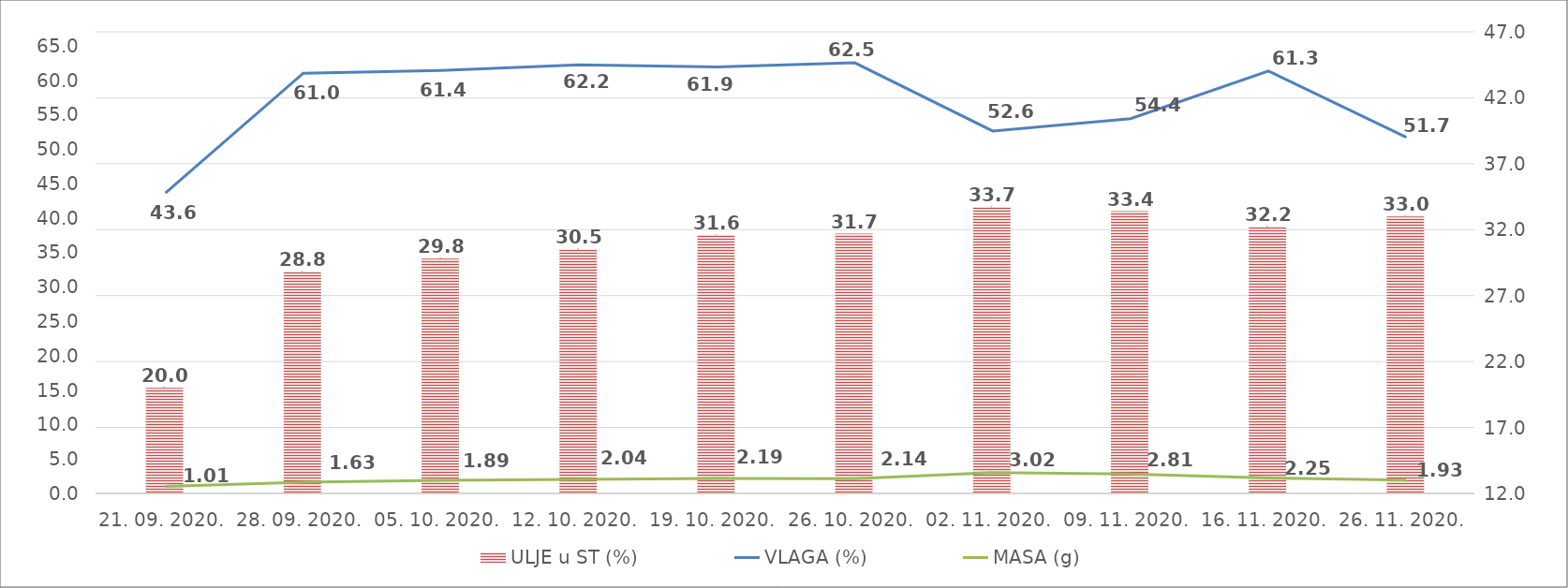
| Category | ULJE u ST (%) |
|---|---|
| 21. 09. 2020. | 20 |
| 28. 09. 2020. | 28.8 |
| 05. 10. 2020. | 29.8 |
| 12. 10. 2020. | 30.5 |
| 19. 10. 2020. | 31.6 |
| 26. 10. 2020. | 31.7 |
| 02. 11. 2020. | 33.7 |
| 09. 11. 2020. | 33.4 |
| 16. 11. 2020. | 32.2 |
| 26. 11. 2020. | 33 |